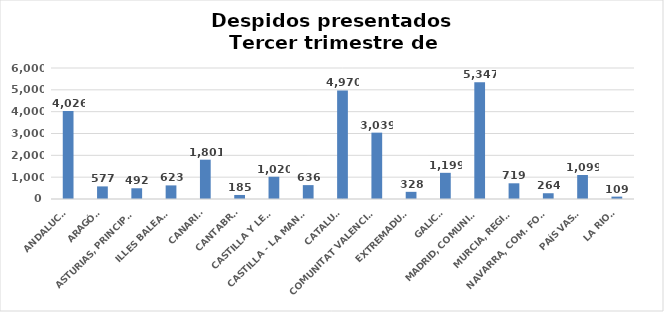
| Category | Series 0 |
|---|---|
| ANDALUCÍA | 4026 |
| ARAGÓN | 577 |
| ASTURIAS, PRINCIPADO | 492 |
| ILLES BALEARS | 623 |
| CANARIAS | 1801 |
| CANTABRIA | 185 |
| CASTILLA Y LEÓN | 1020 |
| CASTILLA - LA MANCHA | 636 |
| CATALUÑA | 4970 |
| COMUNITAT VALENCIANA | 3039 |
| EXTREMADURA | 328 |
| GALICIA | 1199 |
| MADRID, COMUNIDAD | 5347 |
| MURCIA, REGIÓN | 719 |
| NAVARRA, COM. FORAL | 264 |
| PAÍS VASCO | 1099 |
| LA RIOJA | 109 |